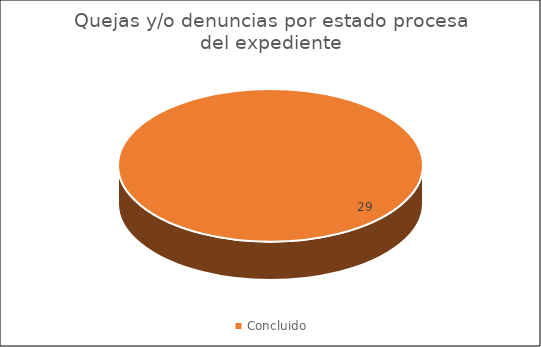
| Category | Quejas y/o denuncias por estado procesal del expediente |
|---|---|
| Concluido | 29 |